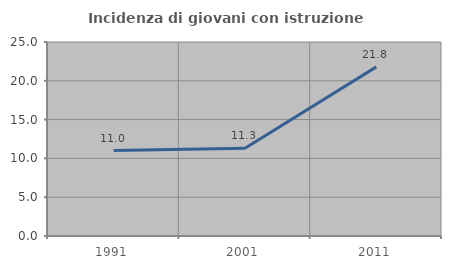
| Category | Incidenza di giovani con istruzione universitaria |
|---|---|
| 1991.0 | 11.017 |
| 2001.0 | 11.304 |
| 2011.0 | 21.795 |